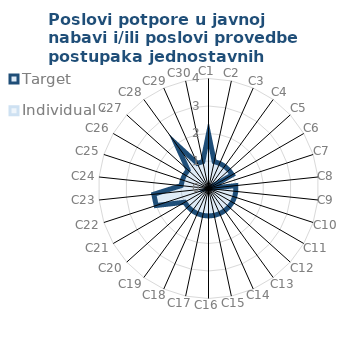
| Category | Target | Individual 4 |
|---|---|---|
| C1 | 2 | 0 |
| C2 | 1 | 0 |
| C3 | 1 | 0 |
| C4 | 1 | 0 |
| C5 | 1 | 0 |
| C6 | 1 | 0 |
| C7 | 0 | 0 |
| C8 | 1 | 0 |
| C9 | 1 | 0 |
| C10 | 1 | 0 |
| C11 | 1 | 0 |
| C12 | 1 | 0 |
| C13 | 1 | 0 |
| C14 | 1 | 0 |
| C15 | 1 | 0 |
| C16 | 1 | 0 |
| C17 | 1 | 0 |
| C18 | 1 | 0 |
| C19 | 1 | 0 |
| C20 | 1 | 0 |
| C21 | 1 | 0 |
| C22 | 2 | 0 |
| C23 | 2 | 0 |
| C24 | 1 | 0 |
| C25 | 1 | 0 |
| C26 | 1 | 0 |
| C27 | 1 | 0 |
| C28 | 2 | 0 |
| C29 | 1 | 0 |
| C30 | 1 | 0 |